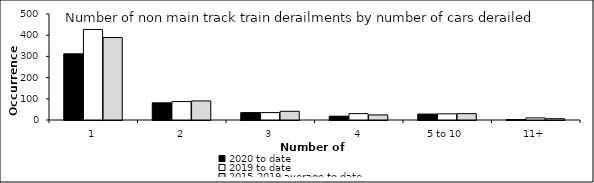
| Category | 2020 to date | 2019 to date | 2015-2019 average to date |
|---|---|---|---|
| 1 | 312 | 427 | 389 |
| 2 | 81 | 87 | 90 |
| 3 | 35 | 35 | 41 |
| 4 | 18 | 30 | 24 |
| 5 to 10 | 28 | 29 | 30 |
| 11+ | 2 | 10 | 6 |